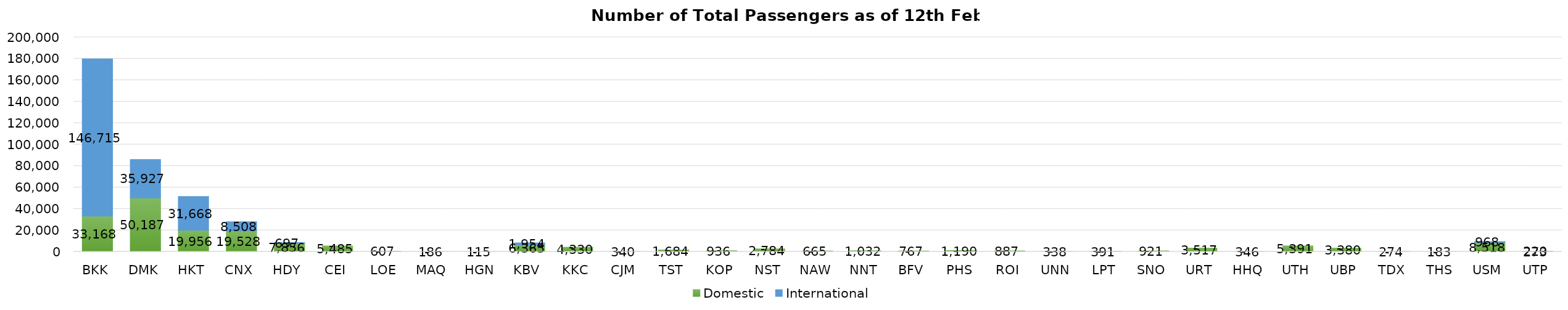
| Category | Domestic | International |
|---|---|---|
| BKK | 33168 | 146715 |
| DMK | 50187 | 35927 |
| HKT | 19956 | 31668 |
| CNX | 19528 | 8508 |
| HDY | 7856 | 697 |
| CEI | 5485 | 0 |
| LOE | 607 | 0 |
| MAQ | 186 | 0 |
| HGN | 115 | 0 |
| KBV | 6365 | 1954 |
| KKC | 4330 | 0 |
| CJM | 340 | 0 |
| TST | 1684 | 0 |
| KOP | 936 | 0 |
| NST | 2784 | 0 |
| NAW | 665 | 0 |
| NNT | 1032 | 0 |
| BFV | 767 | 0 |
| PHS | 1190 | 0 |
| ROI | 887 | 0 |
| UNN | 338 | 0 |
| LPT | 391 | 0 |
| SNO | 921 | 0 |
| URT | 3517 | 0 |
| HHQ | 346 | 0 |
| UTH | 5391 | 0 |
| UBP | 3380 | 0 |
| TDX | 274 | 0 |
| THS | 183 | 0 |
| USM | 8518 | 968 |
| UTP | 273 | 220 |